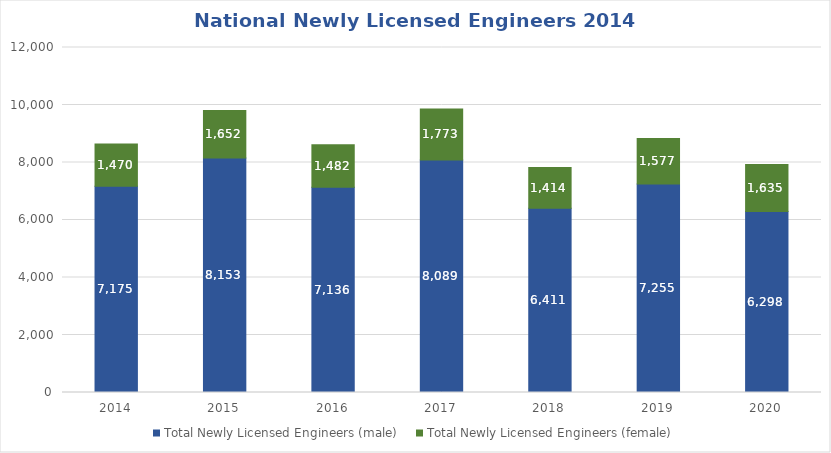
| Category | Total Newly Licensed Engineers (male) | Total Newly Licensed Engineers (female) |
|---|---|---|
| 2014.0 | 7175 | 1470 |
| 2015.0 | 8153 | 1652 |
| 2016.0 | 7136 | 1482 |
| 2017.0 | 8089 | 1773 |
| 2018.0 | 6411 | 1414 |
| 2019.0 | 7255 | 1577 |
| 2020.0 | 6298 | 1635 |